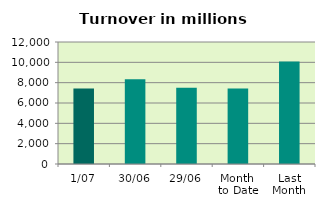
| Category | Series 0 |
|---|---|
| 1/07 | 7417.437 |
| 30/06 | 8324.272 |
| 29/06 | 7511.752 |
| Month 
to Date | 7417.437 |
| Last
Month | 10085.617 |